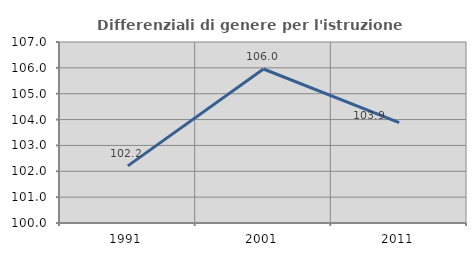
| Category | Differenziali di genere per l'istruzione superiore |
|---|---|
| 1991.0 | 102.209 |
| 2001.0 | 105.956 |
| 2011.0 | 103.879 |